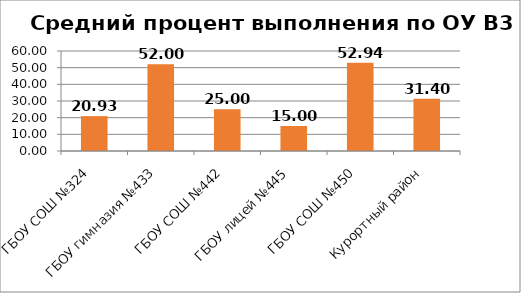
| Category | B3 |
|---|---|
| ГБОУ СОШ №324 | 20.93 |
| ГБОУ гимназия №433 | 52 |
| ГБОУ СОШ №442 | 25 |
| ГБОУ лицей №445 | 15 |
| ГБОУ СОШ №450 | 52.941 |
| Курортный район | 31.405 |